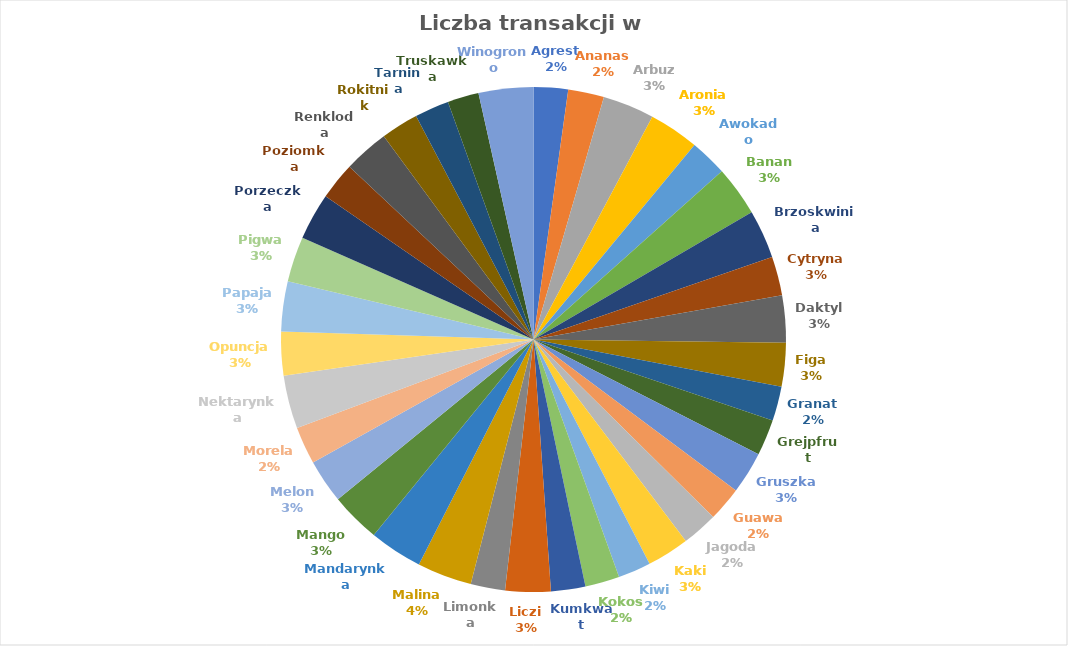
| Category | Liczba transakcji w procentach |
|---|---|
| Agrest | 0.022 |
| Ananas | 0.023 |
| Arbuz | 0.033 |
| Aronia | 0.032 |
| Awokado | 0.024 |
| Banan | 0.032 |
| Brzoskwinia | 0.031 |
| Cytryna | 0.025 |
| Daktyl | 0.03 |
| Figa | 0.028 |
| Granat | 0.022 |
| Grejpfrut | 0.023 |
| Gruszka | 0.027 |
| Guawa | 0.022 |
| Jagoda | 0.023 |
| Kaki | 0.027 |
| Kiwi | 0.021 |
| Kokos | 0.022 |
| Kumkwat | 0.022 |
| Liczi | 0.029 |
| Limonka | 0.022 |
| Malina | 0.035 |
| Mandarynka | 0.034 |
| Mango | 0.032 |
| Melon | 0.028 |
| Morela | 0.024 |
| Nektarynka | 0.034 |
| Opuncja | 0.028 |
| Papaja | 0.032 |
| Pigwa | 0.029 |
| Porzeczka | 0.03 |
| Poziomka | 0.024 |
| Renkloda | 0.029 |
| Rokitnik | 0.024 |
| Tarnina | 0.022 |
| Truskawka | 0.02 |
| Winogrono | 0.035 |